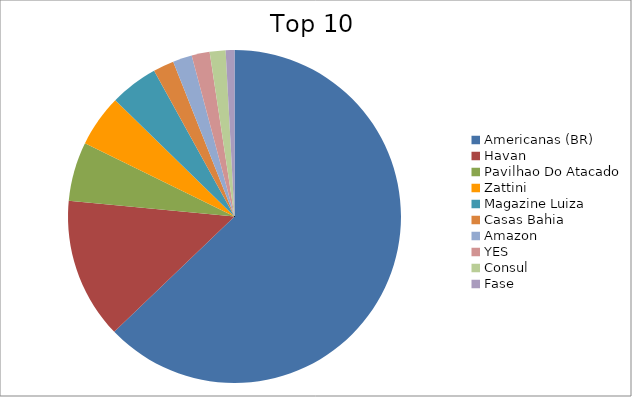
| Category | Series 0 |
|---|---|
| Americanas (BR) | 62.84 |
| Havan | 13.66 |
| Pavilhao Do Atacado | 5.74 |
| Zattini | 5.05 |
| Magazine Luiza | 4.68 |
| Casas Bahia | 2.02 |
| Amazon | 1.86 |
| YES | 1.75 |
| Consul | 1.54 |
| Fase | 0.85 |